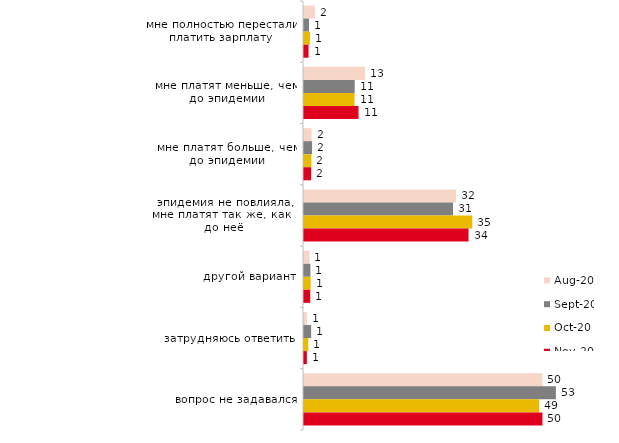
| Category | авг.20 | сен.20 | окт.20 | ноя.20 |
|---|---|---|---|---|
| мне полностью перестали платить зарплату | 2.284 | 1.045 | 1.246 | 0.95 |
| мне платят меньше, чем до эпидемии | 12.761 | 10.602 | 10.563 | 11.4 |
| мне платят больше, чем до эпидемии | 1.589 | 1.692 | 1.545 | 1.5 |
| эпидемия не повлияла, мне платят так же, как и до неё | 31.778 | 31.16 | 35.177 | 34.4 |
| другой вариант | 1.142 | 1.344 | 1.395 | 1.3 |
| затрудняюсь ответить | 0.596 | 1.493 | 0.897 | 0.6 |
| вопрос не задавался | 49.851 | 52.663 | 49.178 | 49.85 |